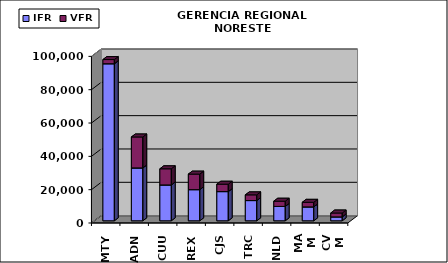
| Category | IFR | VFR |
|---|---|---|
| MTY | 94259 | 2507 |
| ADN | 31732 | 18579 |
| CUU | 21522 | 9685 |
| REX | 18701 | 9323 |
| CJS | 17524 | 4447 |
| TRC | 12144 | 3420 |
| NLD | 8638 | 3130 |
| MAM | 8341 | 2764 |
| CVM | 2345 | 2338 |